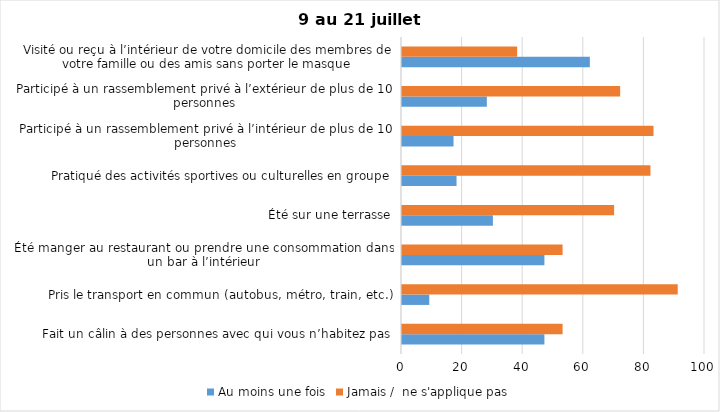
| Category | Au moins une fois | Jamais /  ne s'applique pas |
|---|---|---|
| Fait un câlin à des personnes avec qui vous n’habitez pas | 47 | 53 |
| Pris le transport en commun (autobus, métro, train, etc.) | 9 | 91 |
| Été manger au restaurant ou prendre une consommation dans un bar à l’intérieur | 47 | 53 |
| Été sur une terrasse | 30 | 70 |
| Pratiqué des activités sportives ou culturelles en groupe | 18 | 82 |
| Participé à un rassemblement privé à l’intérieur de plus de 10 personnes | 17 | 83 |
| Participé à un rassemblement privé à l’extérieur de plus de 10 personnes | 28 | 72 |
| Visité ou reçu à l’intérieur de votre domicile des membres de votre famille ou des amis sans porter le masque | 62 | 38 |